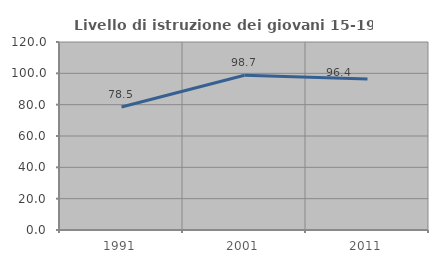
| Category | Livello di istruzione dei giovani 15-19 anni |
|---|---|
| 1991.0 | 78.519 |
| 2001.0 | 98.734 |
| 2011.0 | 96.364 |